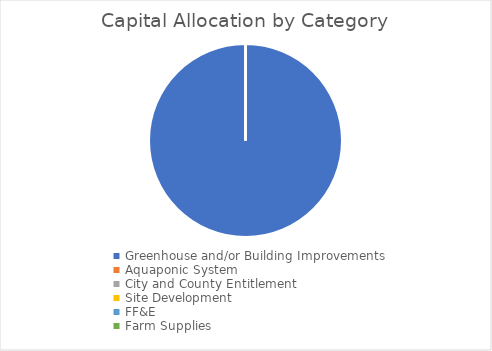
| Category | Series 0 |
|---|---|
| Greenhouse and/or Building Improvements | 50000 |
| Aquaponic System | 0 |
| City and County Entitlement | 0 |
| Site Development | 0 |
| FF&E | 0 |
| Farm Supplies | 0 |